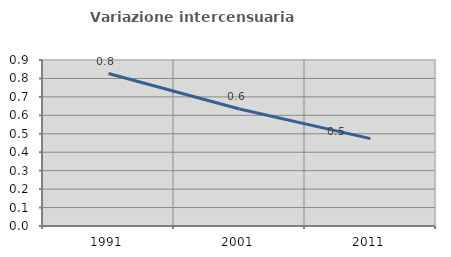
| Category | Variazione intercensuaria annua |
|---|---|
| 1991.0 | 0.827 |
| 2001.0 | 0.634 |
| 2011.0 | 0.474 |